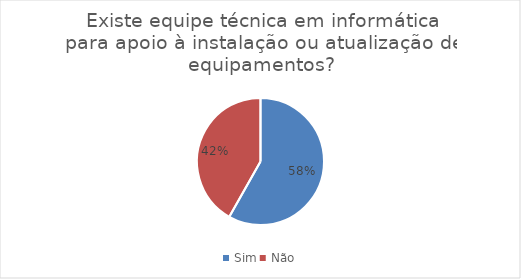
| Category | Series 0 |
|---|---|
| Sim | 96 |
| Não | 69 |